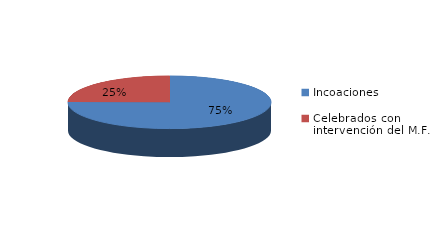
| Category | Series 0 |
|---|---|
| Incoaciones | 8715 |
| Celebrados con intervención del M.F. | 2871 |